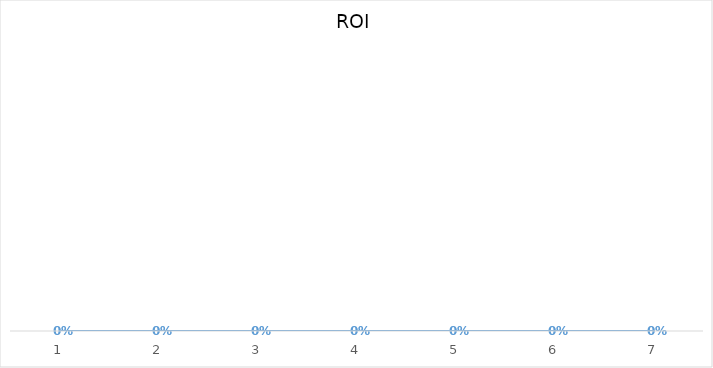
| Category | ROI |
|---|---|
| 0 | 0 |
| 1 | 0 |
| 2 | 0 |
| 3 | 0 |
| 4 | 0 |
| 5 | 0 |
| 6 | 0 |